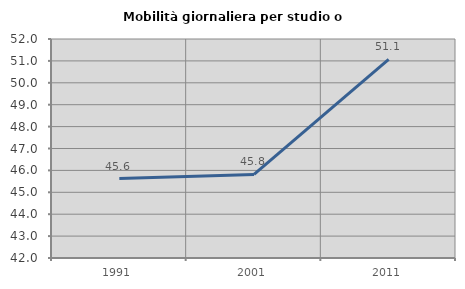
| Category | Mobilità giornaliera per studio o lavoro |
|---|---|
| 1991.0 | 45.629 |
| 2001.0 | 45.816 |
| 2011.0 | 51.069 |